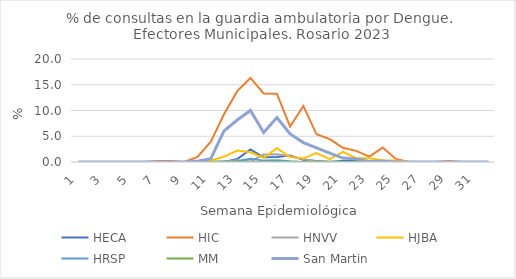
| Category | HECA | HIC | HNVV | HJBA | HRSP | MM | San Martin |
|---|---|---|---|---|---|---|---|
| 1.0 | 0 | 0 | 0 | 0 | 0 | 0 | 0 |
| 2.0 | 0 | 0 | 0 | 0 | 0 | 0 | 0 |
| 3.0 | 0 | 0 | 0 | 0 | 0 | 0 | 0 |
| 4.0 | 0 | 0 | 0 | 0 | 0 | 0 | 0 |
| 5.0 | 0 | 0 | 0 | 0 | 0 | 0 | 0 |
| 6.0 | 0 | 0 | 0 | 0 | 0 | 0 | 0 |
| 7.0 | 0 | 0.195 | 0 | 0 | 0 | 0 | 0 |
| 8.0 | 0 | 0.177 | 0 | 0 | 0 | 0 | 0 |
| 9.0 | 0 | 0 | 0 | 0 | 0 | 0 | 0 |
| 10.0 | 0 | 0.976 | 0 | 0 | 0.09 | 0 | 0.135 |
| 11.0 | 0 | 3.929 | 0.106 | 0.308 | 0 | 0 | 0.644 |
| 12.0 | 0 | 9.277 | 0.101 | 1.039 | 0.08 | 0 | 6.051 |
| 13.0 | 0.591 | 13.756 | 0.354 | 2.227 | 0.148 | 0 | 8.144 |
| 14.0 | 2.425 | 16.318 | 0.076 | 1.875 | 0.613 | 0 | 10 |
| 15.0 | 0.901 | 13.303 | 1.447 | 0.804 | 0.268 | 0 | 5.731 |
| 16.0 | 0.99 | 13.275 | 1.523 | 2.696 | 0.351 | 0 | 8.63 |
| 17.0 | 1.268 | 6.87 | 1.114 | 0.943 | 0.133 | 0 | 5.449 |
| 18.0 | 0.421 | 10.87 | 0.575 | 0.709 | 0 | 0 | 3.763 |
| 19.0 | 0.197 | 5.376 | 0.077 | 1.711 | 0.066 | 0 | 2.738 |
| 20.0 | 0 | 4.444 | 0.086 | 0.539 | 0 | 0 | 1.726 |
| 21.0 | 0.223 | 2.768 | 0 | 1.961 | 0 | 0 | 0.76 |
| 22.0 | 0.202 | 2.156 | 0 | 0.732 | 0 | 0 | 0.6 |
| 23.0 | 0 | 1.048 | 0 | 0.733 | 0 | 0 | 0.117 |
| 24.0 | 0.225 | 2.794 | 0.232 | 0.339 | 0 | 0 | 0.133 |
| 25.0 | 0 | 0.6 | 0 | 0.297 | 0 | 0 | 0 |
| 26.0 | 0 | 0 | 0 | 0 | 0 | 0 | 0 |
| 27.0 | 0 | 0 | 0 | 0 | 0 | 0 | 0 |
| 28.0 | 0 | 0 | 0 | 0 | 0 | 0 | 0 |
| 29.0 | 0 | 0.18 | 0 | 0 | 0 | 0 | 0 |
| 30.0 | 0 | 0 | 0 | 0 | 0 | 0 | 0 |
| 31.0 | 0 | 0 | 0 | 0 | 0 | 0 | 0 |
| 32.0 | 0 | 0 | 0 | 0 | 0 | 0 | 0 |